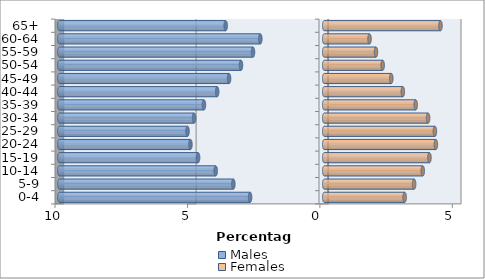
| Category | Males | Females |
|---|---|---|
| 0-4 | -2.798 | 3.037 |
| 5-9 | -3.431 | 3.394 |
| 10-14 | -4.096 | 3.72 |
| 15-19 | -4.761 | 3.972 |
| 20-24 | -5.05 | 4.215 |
| 25-29 | -5.16 | 4.179 |
| 30-34 | -4.913 | 3.922 |
| 35-39 | -4.541 | 3.454 |
| 40-44 | -4.041 | 2.968 |
| 45-49 | -3.592 | 2.532 |
| 50-54 | -3.142 | 2.206 |
| 55-59 | -2.688 | 1.954 |
| 60-64 | -2.413 | 1.711 |
| 65+ | -3.72 | 4.39 |